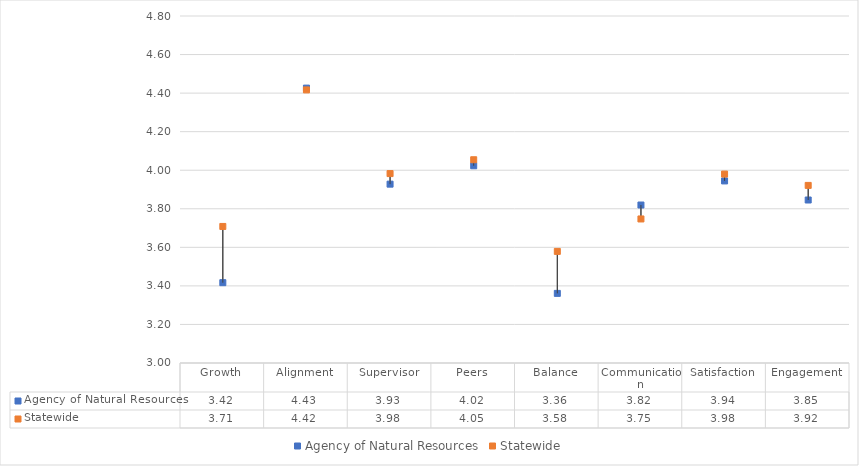
| Category | Agency of Natural Resources | Statewide |
|---|---|---|
| Growth | 3.417 | 3.708 |
| Alignment | 4.426 | 4.417 |
| Supervisor | 3.928 | 3.983 |
| Peers | 4.023 | 4.054 |
| Balance | 3.361 | 3.579 |
| Communication | 3.819 | 3.747 |
| Satisfaction | 3.944 | 3.98 |
| Engagement | 3.846 | 3.921 |